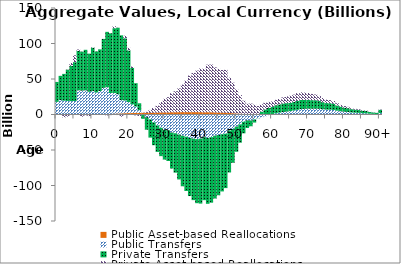
| Category | Public Asset-based Reallocations | Public Transfers | Private Transfers | Private Asset-based Reallocations |
|---|---|---|---|---|
| 0 | 187.914 | 17559.228 | 28079.845 | 109.439 |
|  | 240.526 | 20106.61 | 34077.942 | -169.85 |
| 2 | 252.993 | 19217.62 | 37722.336 | -4127.463 |
| 3 | 266.121 | 18840.909 | 44081.584 | -3039.89 |
| 4 | 276.008 | 18519.051 | 49757.27 | 4038.723 |
| 5 | 290.554 | 18759.55 | 54660.902 | 9721.396 |
| 6 | 294.704 | 33745.352 | 55660.916 | 1845.506 |
| 7 | 304.643 | 33297.776 | 54984.732 | -3115.571 |
| 8 | 335.867 | 33642.554 | 57156.645 | -1192.392 |
| 9 | 330.443 | 31639.192 | 53753.912 | -2239.276 |
| 10 | 393.44 | 32570.402 | 61201.251 | 650.29 |
| 11 | 392.704 | 30653.668 | 57816.963 | -503.585 |
| 12 | 436.291 | 32668.978 | 58643.648 | 151.822 |
| 13 | 578.063 | 36919.537 | 68982.079 | -431.441 |
| 14 | 750.786 | 37698.751 | 77956.487 | -1311.899 |
| 15 | 944.172 | 29291.282 | 84164.295 | -866.686 |
| 16 | 1185.965 | 29008.557 | 91311.282 | 2773.659 |
| 17 | 1405.596 | 27204.629 | 93630.575 | -760.599 |
| 18 | 1579.342 | 18727.689 | 91174.551 | -3113.184 |
| 19 | 1813.947 | 17819.953 | 87715.65 | 3617.094 |
| 20 | 1948.896 | 15601.484 | 72730.271 | 3647.077 |
| 21 | 2058.194 | 12284.712 | 51128.752 | 2121.323 |
| 22 | 2454.33 | 8808.122 | 32799.199 | -1228.236 |
| 23 | 2256.306 | 3915.229 | 9650.328 | -2120.586 |
| 24 | 2330.292 | 51.285 | -6116.997 | 457.792 |
| 25 | 2410.334 | -3650.102 | -17787.415 | 1333.475 |
| 26 | 2466.728 | -7045.134 | -25502.364 | 3961.214 |
| 27 | 2614.811 | -11131.022 | -32101.07 | 6681.305 |
| 28 | 2758.719 | -15415.625 | -37278.829 | 9670.496 |
| 29 | 2836.336 | -18724.901 | -39904.766 | 14767.208 |
| 30 | 2935.111 | -21438.294 | -42057.06 | 19144.462 |
| 31 | 2912.417 | -22316.349 | -43200.711 | 21481.657 |
| 32 | 3196.527 | -25350.188 | -50744.96 | 26784.676 |
| 33 | 3210.127 | -26411.415 | -55497.71 | 29567.318 |
| 34 | 3307.222 | -28257.729 | -63224.688 | 33447.042 |
| 35 | 3363.07 | -29863.323 | -71216.957 | 38761.879 |
| 36 | 3340.466 | -31254.274 | -76461.53 | 44450.591 |
| 37 | 3325.498 | -32951.581 | -81901.301 | 51545.678 |
| 38 | 3331.831 | -33928.994 | -86674.198 | 55286.629 |
| 39 | 3363.317 | -34642.41 | -90265.699 | 58477.94 |
| 40 | 3273.271 | -33980.321 | -91512.793 | 61497.499 |
| 41 | 3096.383 | -31870.089 | -88784.929 | 61197.826 |
| 42 | 3231.112 | -32961.525 | -92829.828 | 66929.862 |
| 43 | 3151.24 | -31927.271 | -92290.537 | 67179.81 |
| 44 | 2965.828 | -29821.115 | -88551.891 | 63467.853 |
| 45 | 2800.984 | -28870.959 | -84883.4 | 61467.299 |
| 46 | 2647.398 | -27765.172 | -80597.079 | 60017.786 |
| 47 | 2586.318 | -27023.022 | -76647.128 | 60309.53 |
| 48 | 2086.799 | -22587.117 | -59082.377 | 49839.138 |
| 49 | 1847.12 | -20284.58 | -47732.704 | 42982.026 |
| 50 | 1529.511 | -17016.343 | -35453.156 | 33948.125 |
| 51 | 1263.81 | -13945.231 | -25751.41 | 26239.996 |
| 52 | 962.613 | -10201.905 | -16320.115 | 18514.834 |
| 53 | 812.114 | -8216.76 | -10739.902 | 14302.259 |
| 54 | 893.79 | -8325.285 | -8238.353 | 14523.699 |
| 55 | 858.846 | -7088.751 | -4268.891 | 13122.778 |
| 56 | 797.346 | -5497.984 | -220.012 | 11220.771 |
| 57 | 773.48 | -4011.251 | 3361.289 | 10277.972 |
| 58 | 750.824 | -2426.86 | 6440.982 | 9481.094 |
| 59 | 697.532 | -990.358 | 8639.538 | 8460.503 |
| 60 | 636.989 | 107.763 | 9972.153 | 7666.026 |
| 61 | 610.422 | 1193.333 | 11260.152 | 7587.959 |
| 62 | 558.557 | 2105.588 | 11599.17 | 7625.503 |
| 63 | 538.247 | 2928.419 | 12053.689 | 8599.192 |
| 64 | 505.879 | 3580.831 | 11926.363 | 9505.26 |
| 65 | 481.093 | 4259.882 | 11715.628 | 9971.056 |
| 66 | 473.123 | 5224.376 | 11941.154 | 10381.216 |
| 67 | 473.443 | 6181.272 | 12519.392 | 10957.457 |
| 68 | 463.347 | 7131.479 | 12819.579 | 10832.244 |
| 69 | 434.094 | 7510.271 | 12607.289 | 10315.465 |
| 70 | 411.073 | 7756.443 | 12533.45 | 9566.828 |
| 71 | 382.892 | 7704.29 | 12110.611 | 8812.344 |
| 72 | 365.981 | 7803.209 | 11917.749 | 8090.217 |
| 73 | 337.477 | 7660.97 | 11247.399 | 7009.101 |
| 74 | 295.046 | 7061.657 | 10044.065 | 5818.11 |
| 75 | 256.391 | 6618.314 | 9217.639 | 4788.624 |
| 76 | 238.01 | 6542.478 | 9104.326 | 4360.749 |
| 77 | 214.841 | 6222.707 | 8714.36 | 3869.802 |
| 78 | 172.815 | 5186.155 | 7403.35 | 3113.837 |
| 79 | 141.544 | 4403.924 | 6453.602 | 2547.369 |
| 80 | 118.746 | 3812.652 | 5774.294 | 2158.701 |
| 81 | 103.156 | 3447.806 | 5415.36 | 1828.704 |
| 82 | 80.515 | 2806.592 | 4599.89 | 1394.219 |
| 83 | 68.197 | 2486.756 | 4257.04 | 1166.827 |
| 84 | 57.919 | 2236.978 | 3996.71 | 1046.795 |
| 85 | 0 | 1896.598 | 3532.068 | 829.425 |
| 86 | 0 | 1723.131 | 3338.122 | 691.039 |
| 87 | 0 | 1181.598 | 2378.903 | 429.289 |
| 88 | 0 | 934.287 | 1942.261 | 317.832 |
| 89 | 0 | 728.485 | 1575.537 | 214.74 |
| 90+ | 0 | 2008.879 | 4526.618 | 491.889 |